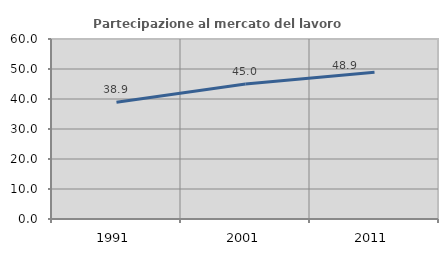
| Category | Partecipazione al mercato del lavoro  femminile |
|---|---|
| 1991.0 | 38.898 |
| 2001.0 | 44.992 |
| 2011.0 | 48.928 |